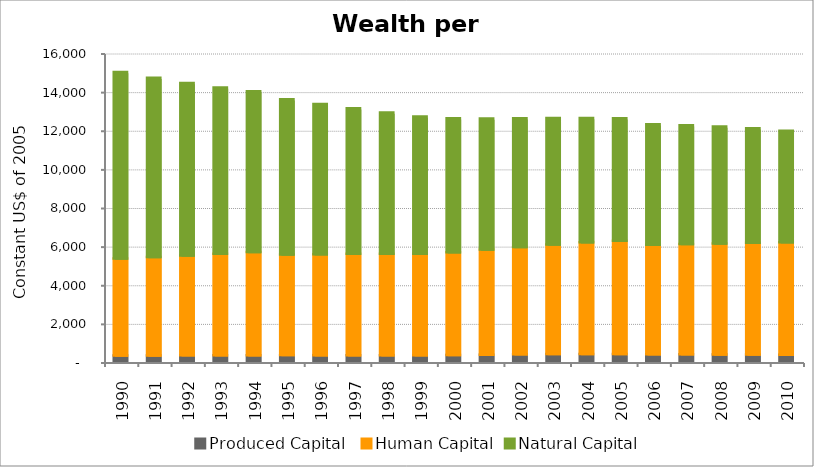
| Category | Produced Capital  | Human Capital | Natural Capital |
|---|---|---|---|
| 1990.0 | 325.613 | 5015.76 | 9663.421 |
| 1991.0 | 329.908 | 5093.76 | 9277.665 |
| 1992.0 | 332.033 | 5174.427 | 8928.96 |
| 1993.0 | 335.798 | 5258.93 | 8610.77 |
| 1994.0 | 340.19 | 5348.05 | 8316.109 |
| 1995.0 | 344.922 | 5205.152 | 8040.349 |
| 1996.0 | 342.176 | 5224.997 | 7780.208 |
| 1997.0 | 339.237 | 5250.148 | 7536.525 |
| 1998.0 | 341.694 | 5250.831 | 7312.314 |
| 1999.0 | 342.069 | 5244.849 | 7112.018 |
| 2000.0 | 354.128 | 5319.197 | 6938.433 |
| 2001.0 | 367.388 | 5441.994 | 6788.678 |
| 2002.0 | 386.575 | 5560.026 | 6657.944 |
| 2003.0 | 402.391 | 5674.629 | 6542.657 |
| 2004.0 | 401.198 | 5786.762 | 6437.95 |
| 2005.0 | 396.191 | 5870.163 | 6338.854 |
| 2006.0 | 391.21 | 5663.869 | 6246.44 |
| 2007.0 | 386.352 | 5706.14 | 6157.049 |
| 2008.0 | 380.83 | 5747.923 | 6058.727 |
| 2009.0 | 373.484 | 5787.315 | 5934.845 |
| 2010.0 | 365.779 | 5822.497 | 5776.464 |